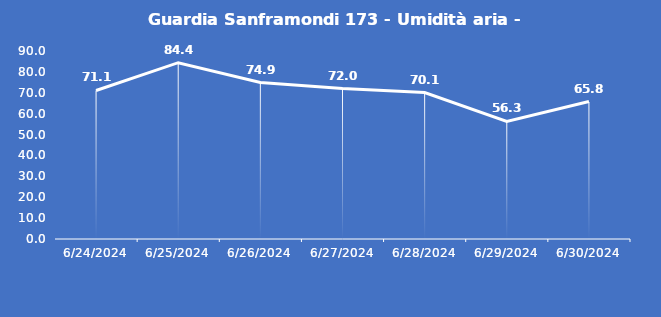
| Category | Guardia Sanframondi 173 - Umidità aria - Grezzo (%) |
|---|---|
| 6/24/24 | 71.1 |
| 6/25/24 | 84.4 |
| 6/26/24 | 74.9 |
| 6/27/24 | 72 |
| 6/28/24 | 70.1 |
| 6/29/24 | 56.3 |
| 6/30/24 | 65.8 |